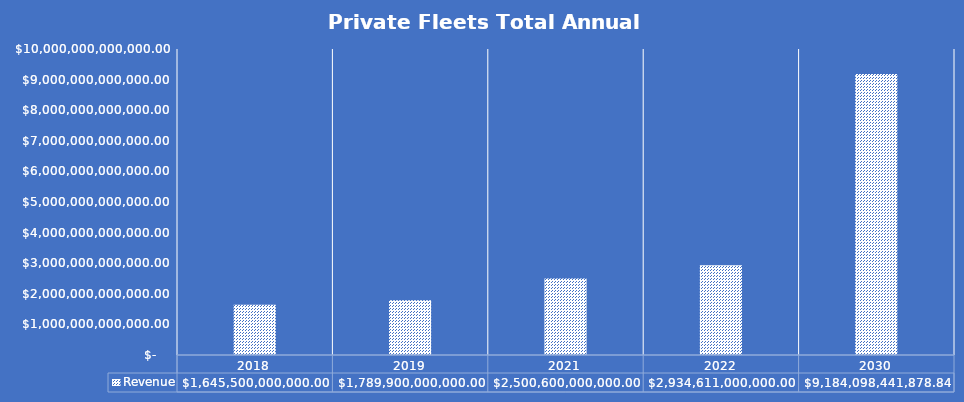
| Category | Revenue |
|---|---|
| 2018.0 | 1645500000000 |
| 2019.0 | 1789900000000 |
| 2021.0 | 2500600000000 |
| 2022.0 | 2934611000000 |
| 2030.0 | 9184098441878.836 |